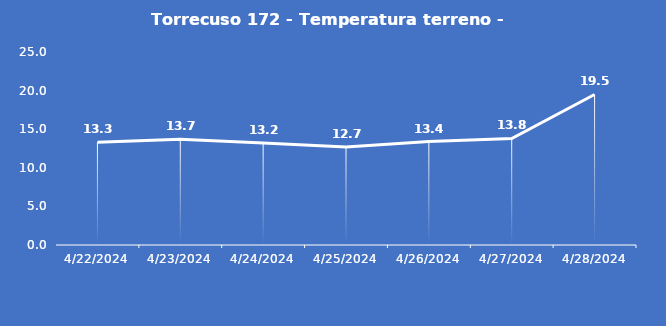
| Category | Torrecuso 172 - Temperatura terreno - Grezzo (°C) |
|---|---|
| 4/22/24 | 13.3 |
| 4/23/24 | 13.7 |
| 4/24/24 | 13.2 |
| 4/25/24 | 12.7 |
| 4/26/24 | 13.4 |
| 4/27/24 | 13.8 |
| 4/28/24 | 19.5 |